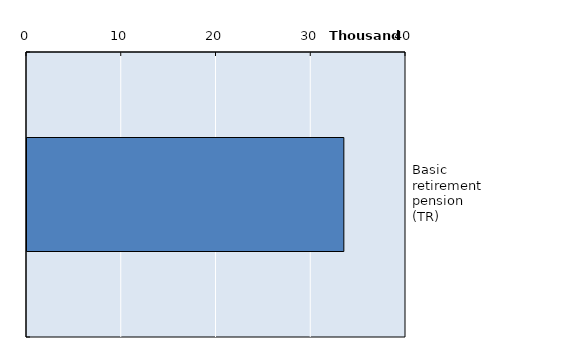
| Category | Series 0 |
|---|---|
| Basic retirement pension (TR) | 33440 |